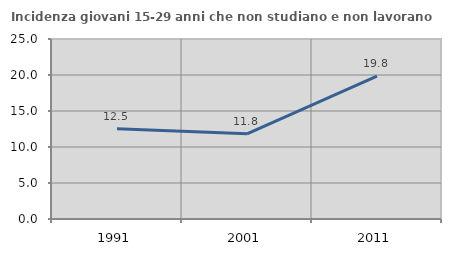
| Category | Incidenza giovani 15-29 anni che non studiano e non lavorano  |
|---|---|
| 1991.0 | 12.524 |
| 2001.0 | 11.83 |
| 2011.0 | 19.843 |